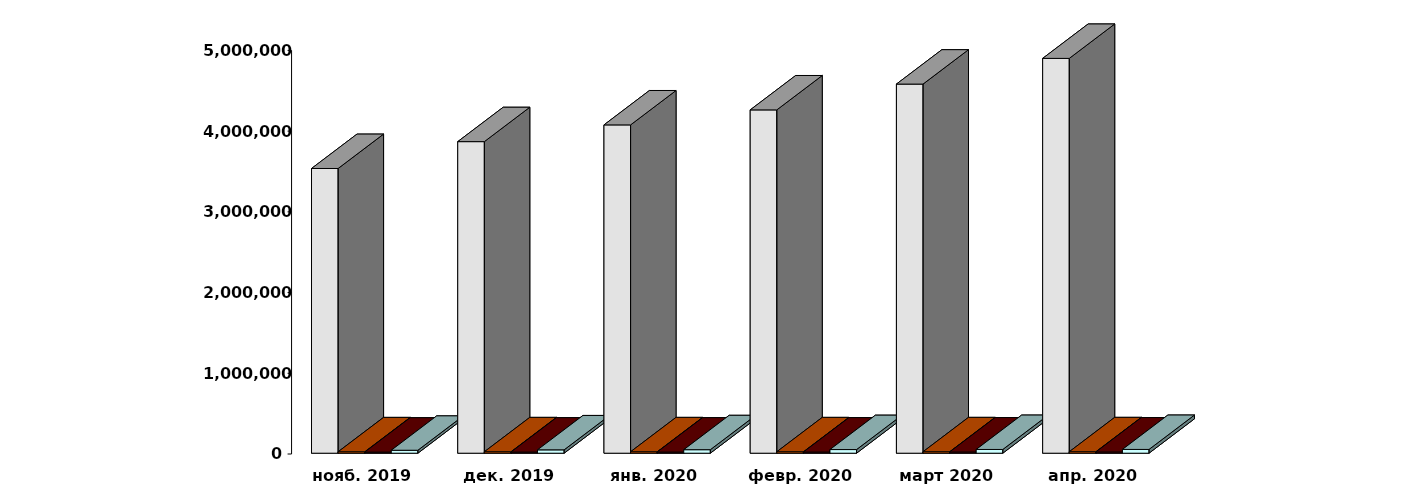
| Category | Физические лица | Юридические лица | Иностранные лица | Клиенты, передавшие свои средства в ДУ |
|---|---|---|---|---|
| 2019-11-29 | 3527188 | 17527 | 13688 | 36567 |
| 2019-12-29 | 3859911 | 17695 | 14011 | 41535 |
| 2020-01-29 | 4067317 | 17706 | 14182 | 43400 |
| 2020-02-29 | 4253153 | 17783 | 14404 | 45201 |
| 2020-03-30 | 4572906 | 17928 | 14988 | 46297 |
| 2020-04-30 | 4891213 | 18138 | 15242 | 46759 |